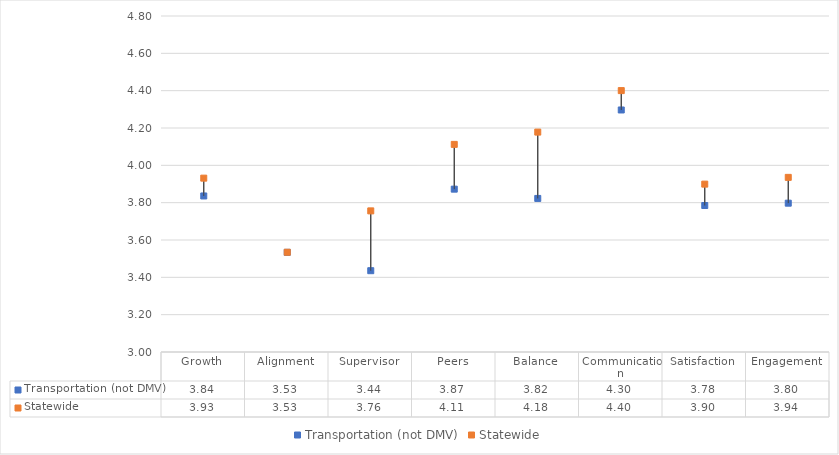
| Category | Transportation (not DMV) | Statewide |
|---|---|---|
| Growth | 3.836 | 3.931 |
| Alignment | 3.534 | 3.534 |
| Supervisor | 3.436 | 3.756 |
| Peers | 3.872 | 4.112 |
| Balance | 3.823 | 4.178 |
| Communication | 4.297 | 4.4 |
| Satisfaction | 3.785 | 3.899 |
| Engagement | 3.797 | 3.936 |